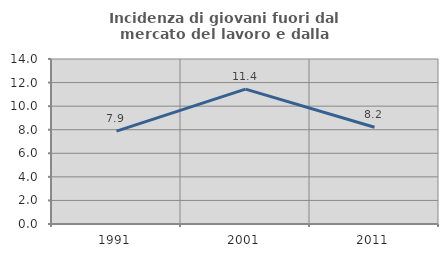
| Category | Incidenza di giovani fuori dal mercato del lavoro e dalla formazione  |
|---|---|
| 1991.0 | 7.877 |
| 2001.0 | 11.439 |
| 2011.0 | 8.213 |